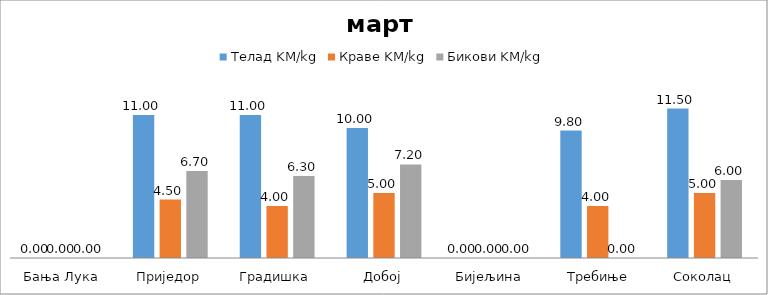
| Category | Телад | Краве | Бикови |
|---|---|---|---|
| Бања Лука | 0 | 0 | 0 |
| Приједор | 11 | 4.5 | 6.7 |
| Градишка | 11 | 4 | 6.3 |
| Добој | 10 | 5 | 7.2 |
| Бијељина | 0 | 0 | 0 |
|  Требиње | 9.8 | 4 | 0 |
| Соколац | 11.5 | 5 | 6 |